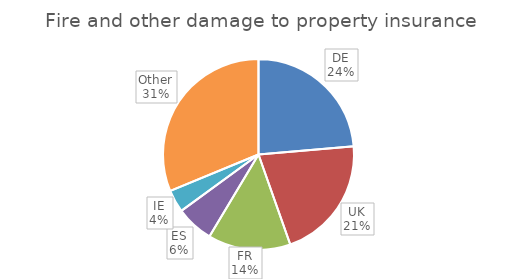
| Category | Fire and other damage to property insurance |
|---|---|
| DE | 223890.74 |
| UK | 198837.54 |
| FR | 132608.25 |
| ES | 60416.83 |
| IE | 36094.36 |
| Other | 296048.77 |